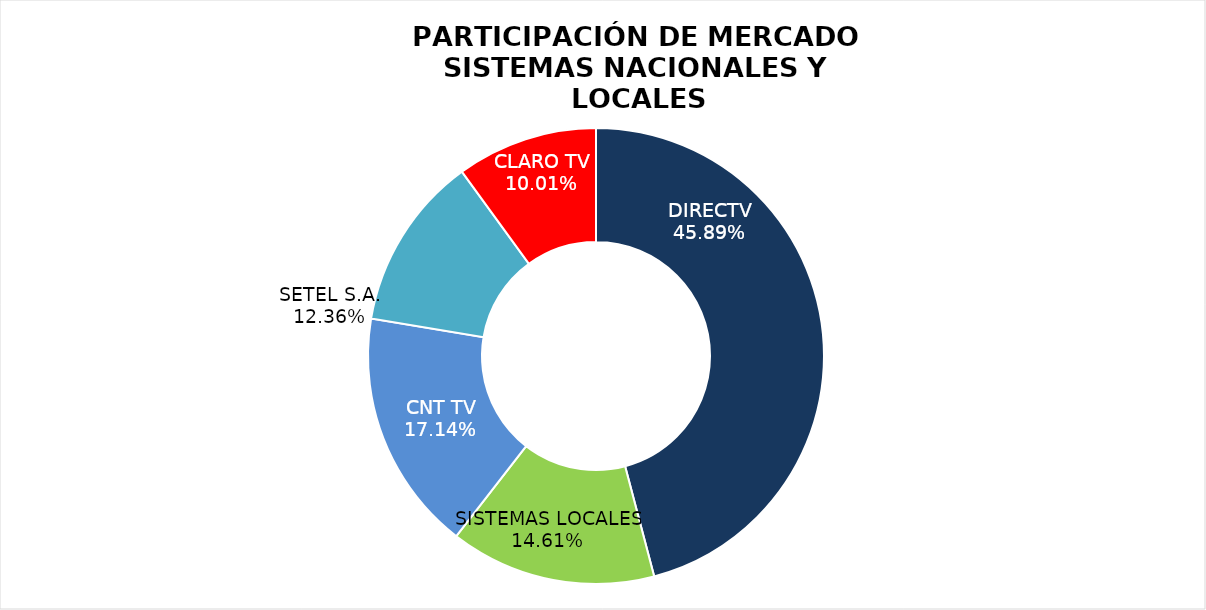
| Category | Series 0 |
|---|---|
| DIRECTV | 194621 |
| SISTEMAS LOCALES | 61942 |
| CNT TV | 72679 |
| SETEL S.A. | 52402 |
| CLARO TV | 42449 |